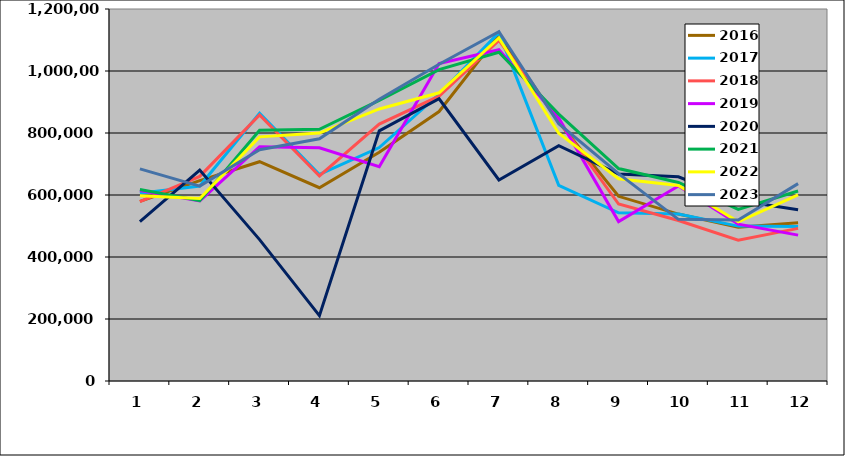
| Category | 2016 | 2017 | 2018 | 2019 | 2020 | 2021 | 2022 | 2023 |
|---|---|---|---|---|---|---|---|---|
| 0 | 579339 | 605351 | 578988 | 614367 | 514063 | 617539 | 597893 | 684186 |
| 1 | 646389 | 628983 | 660051 | 580719 | 680317 | 581812 | 588545 | 628743 |
| 2 | 707409 | 863694 | 858576 | 755903 | 456152 | 808815 | 787510 | 746152 |
| 3 | 623538 | 666219 | 661275 | 752579 | 210787 | 811765 | 799739 | 781298 |
| 4 | 737676 | 753130 | 828753 | 691235 | 806936 | 905155 | 877529 | 909096 |
| 5 | 869259 | 924920 | 918969 | 1024158 | 910442 | 1004703 | 929743 | 1021834 |
| 6 | 1115932 | 1123915 | 1099082 | 1068463 | 648481 | 1060425 | 1106567 | 1126555 |
| 7 | 835114 | 630959 | 838562 | 848692 | 759039 | 860899 | 799185 | 830042 |
| 8 | 595754 | 542362 | 570947 | 514226 | 667364 | 685207 | 652264 | 668736 |
| 9 | 538479 | 538845 | 517865 | 628782 | 658753 | 640527 | 630539 | 521382 |
| 10 | 496333 | 499602 | 454232 | 506068 | 582093 | 553821 | 513641 | 519135 |
| 11 | 510103 | 498665 | 492317 | 470640 | 552263 | 612949 | 600129 | 636778 |